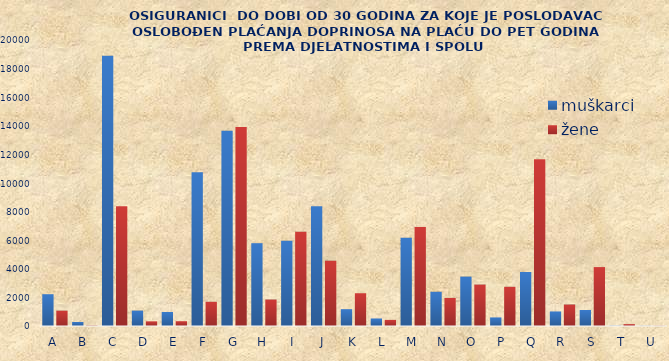
| Category | muškarci | žene |
|---|---|---|
| A | 2224 | 1073 |
| B | 280 | 30 |
| C | 18892 | 8368 |
| D | 1078 | 326 |
| E | 981 | 335 |
| F | 10754 | 1694 |
| G | 13661 | 13911 |
| H | 5791 | 1852 |
| I | 5968 | 6593 |
| J | 8367 | 4565 |
| K | 1177 | 2291 |
| L | 526 | 428 |
| M | 6172 | 6923 |
| N | 2394 | 1963 |
| O | 3455 | 2897 |
| P | 600 | 2742 |
| Q | 3776 | 11662 |
| R | 1017 | 1501 |
| S | 1120 | 4120 |
| T | 20 | 130 |
| U | 11 | 14 |